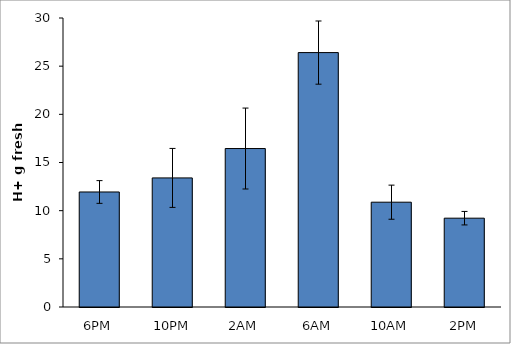
| Category | Series 0 |
|---|---|
| 6PM | 11.94 |
| 10PM | 13.4 |
| 2AM | 16.45 |
| 6AM | 26.41 |
| 10AM | 10.88 |
| 2PM | 9.22 |